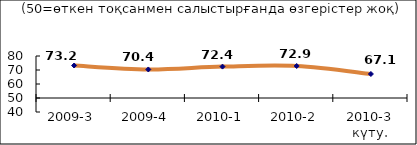
| Category | Диф.индекс ↓ |
|---|---|
| 2009-3 | 73.205 |
| 2009-4 | 70.39 |
| 2010-1 | 72.43 |
| 2010-2 | 72.86 |
| 2010-3 күту. | 67.145 |